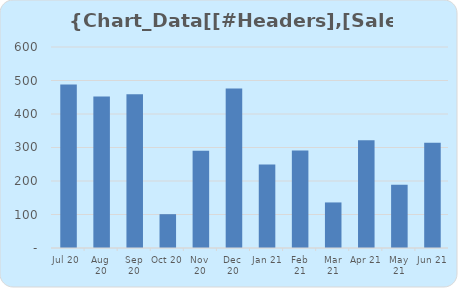
| Category | Sales |
|---|---|
| 2020-07-01 | 488 |
| 2020-08-01 | 452 |
| 2020-09-01 | 459 |
| 2020-10-01 | 101 |
| 2020-11-01 | 290 |
| 2020-12-01 | 476 |
| 2021-01-01 | 249 |
| 2021-02-01 | 291 |
| 2021-03-01 | 136 |
| 2021-04-01 | 322 |
| 2021-05-01 | 189 |
| 2021-06-01 | 314 |